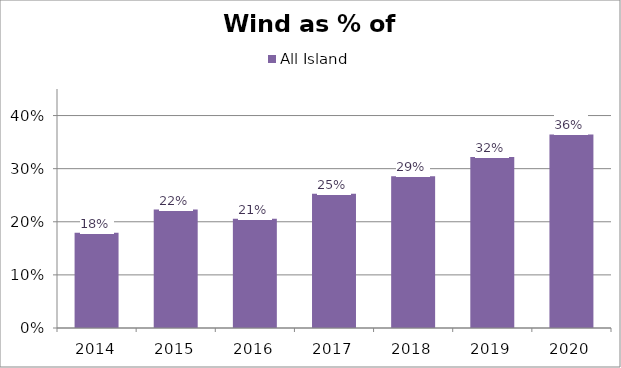
| Category | All Island |
|---|---|
| 2014.0 | 0.18 |
| 2015.0 | 0.223 |
| 2016.0 | 0.206 |
| 2017.0 | 0.253 |
| 2018.0 | 0.286 |
| 2019.0 | 0.322 |
| 2020.0 | 0.364 |